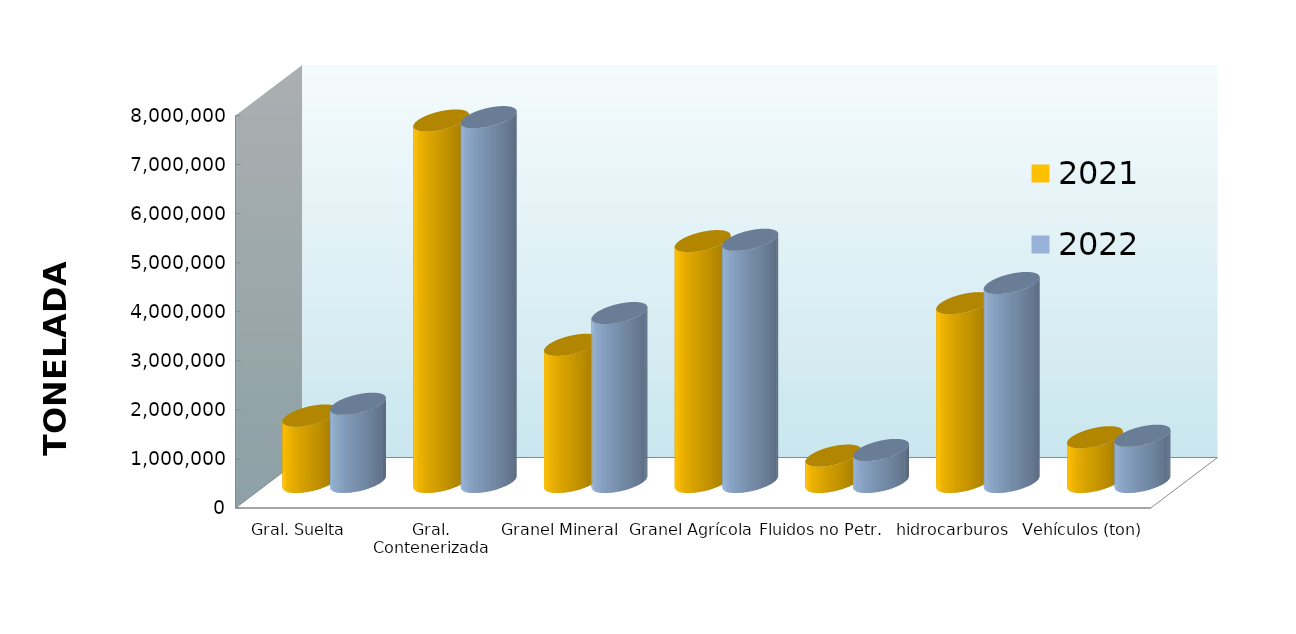
| Category | 2021 | 2022 |
|---|---|---|
| Gral. Suelta | 1355617.042 | 1594809.765 |
| Gral. Contenerizada | 7367987.825 | 7436359.441 |
| Granel Mineral | 2795956.408 | 3443094.013 |
| Granel Agrícola | 4909353.266 | 4937884.688 |
| Fluidos no Petr. | 538197.874 | 652782.717 |
| hidrocarburos | 3644385.258 | 4055675.887 |
| Vehículos (ton) | 912149.118 | 942995.227 |